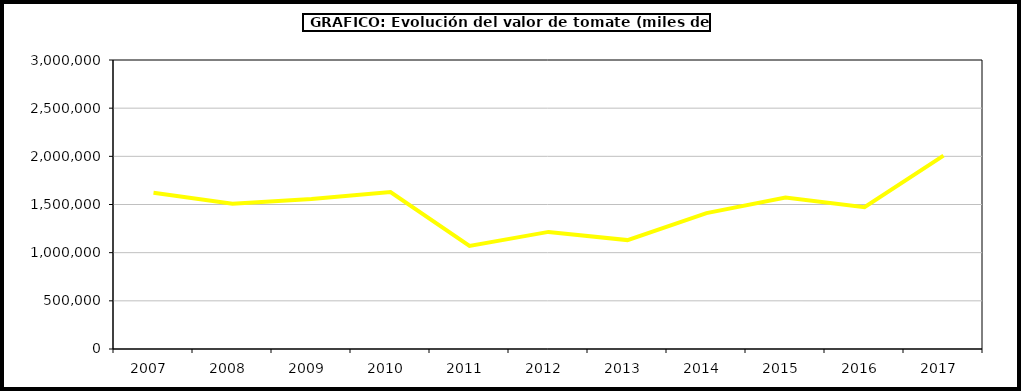
| Category | Valor |
|---|---|
| 2007.0 | 1622795.255 |
| 2008.0 | 1508532.993 |
| 2009.0 | 1556488.393 |
| 2010.0 | 1629341.46 |
| 2011.0 | 1069974.828 |
| 2012.0 | 1215542.465 |
| 2013.0 | 1130344.662 |
| 2014.0 | 1410496.854 |
| 2015.0 | 1573527 |
| 2016.0 | 1471672 |
| 2017.0 | 2007555.581 |